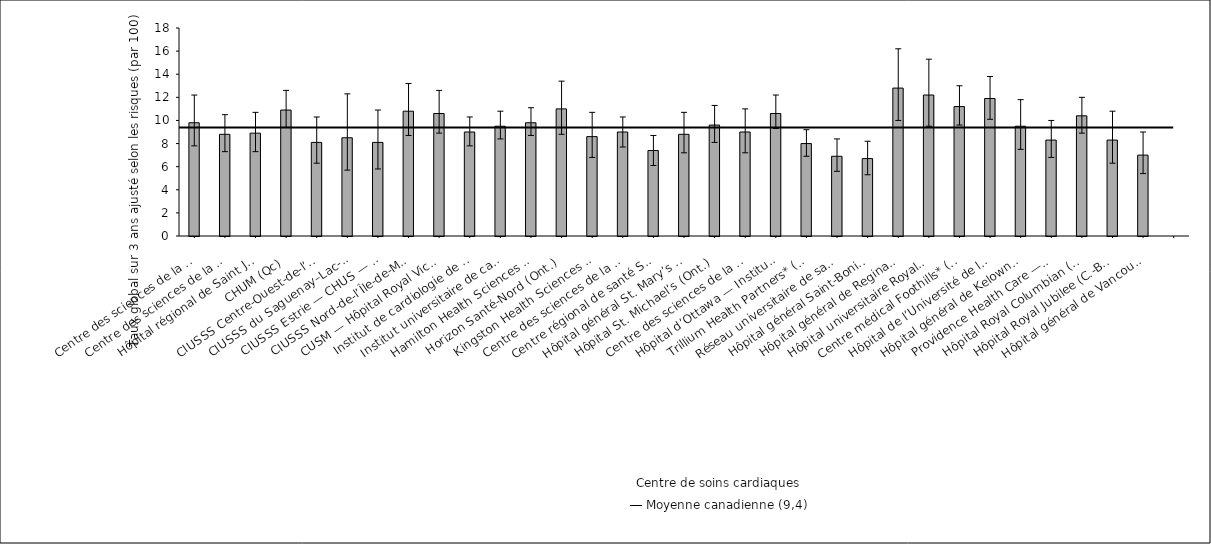
| Category | Taux ajusté selon les risques |
|---|---|
| Centre des sciences de la santé — St. John’s (T. -N.-L.) | 9.8 |
| Centre des sciences de la santé Queen Elizabeth II (N.-É.) | 8.8 |
| Hôpital régional de Saint John (N.-B.) | 8.9 |
| CHUM (Qc) | 10.9 |
| CIUSSS Centre-Ouest-de-l’Île-de-Mtl — Hôpital général juif (Qc) | 8.1 |
| CIUSSS du Saguenay–Lac-St-Jean — Hôpital de Chicoutimi (Qc) | 8.5 |
| CIUSSS Estrie — CHUS — Hôpital Fleurimont (Qc) | 8.1 |
| CIUSSS Nord-de-l’Île-de-Montréal — Hôpital du Sacré-Cœur de Montréal (Qc) | 10.8 |
| CUSM — Hôpital Royal Victoria (Qc) | 10.6 |
| Institut de cardiologie de Montréal (Qc) | 9 |
| Institut universitaire de cardiologie et pneumologie de Québec (Qc) | 9.5 |
| Hamilton Health Sciences (Ont.) | 9.8 |
| Horizon Santé-Nord (Ont.) | 11 |
| Kingston Health Sciences Centre (Ont.) | 8.6 |
| Centre des sciences de la santé de London (Ont.) | 9 |
| Centre régional de santé Southlake* (Ont.) | 7.4 |
| Hôpital général St. Mary’s (Ont.) | 8.8 |
| Hôpital St. Michael’s (Ont.) | 9.6 |
| Centre des sciences de la santé Sunnybrook (Ont.) | 9 |
| Hôpital d’Ottawa — Institut de cardiologie de l’Université d’Ottawa (Ont.) | 10.6 |
| Trillium Health Partners* (Ont.) | 8 |
| Réseau universitaire de santé* (Ont.) | 6.9 |
| Hôpital général Saint-Boniface* (Man.) | 6.7 |
| Hôpital général de Regina* (Sask.) | 12.8 |
| Hôpital universitaire Royal* (Sask.) | 12.2 |
| Centre médical Foothills* (Alb.) | 11.2 |
| Hôpital de l’Université de l’Alberta* (Alb.) | 11.9 |
| Hôpital général de Kelowna (C.-B.) | 9.5 |
| Providence Health Care — Hôpital St. Paul’s (Vancouver) (C.-B.) | 8.3 |
| Hôpital Royal Columbian (C.-B.) | 10.4 |
| Hôpital Royal Jubilee (C.-B.) | 8.3 |
| Hôpital général de Vancouver* (C.-B.) | 7 |